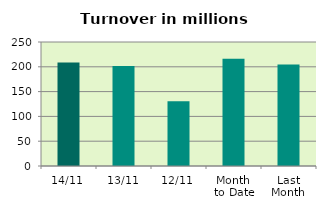
| Category | Series 0 |
|---|---|
| 14/11 | 208.711 |
| 13/11 | 201.552 |
| 12/11 | 130.59 |
| Month 
to Date | 216.35 |
| Last
Month | 204.729 |